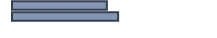
| Category | 47,2 |
|---|---|
| 0 | 47.2 |
| 1 | 52.8 |